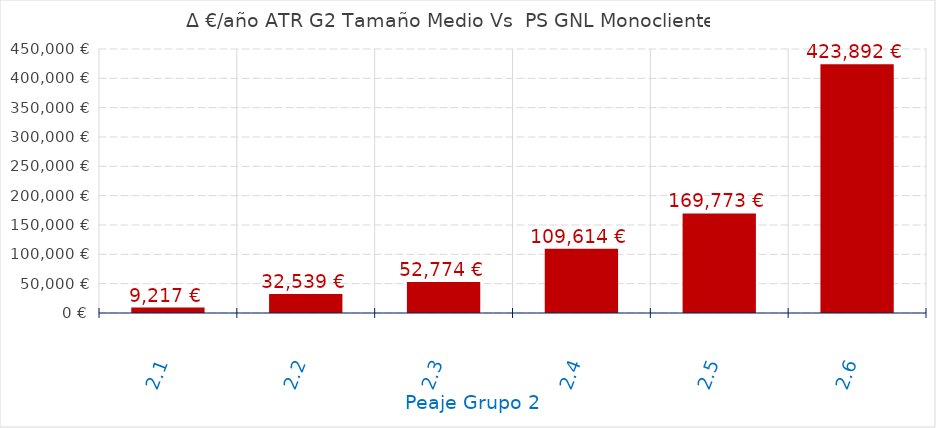
| Category | D €/año |
|---|---|
| 2.1 | 9217.06 |
| 2.2 | 32538.524 |
| 2.3 | 52774.024 |
| 2.4 | 109613.529 |
| 2.5 | 169772.996 |
| 2.6 | 423892.173 |